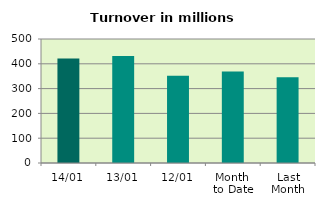
| Category | Series 0 |
|---|---|
| 14/01 | 420.906 |
| 13/01 | 431.502 |
| 12/01 | 352.235 |
| Month 
to Date | 368.464 |
| Last
Month | 346.191 |